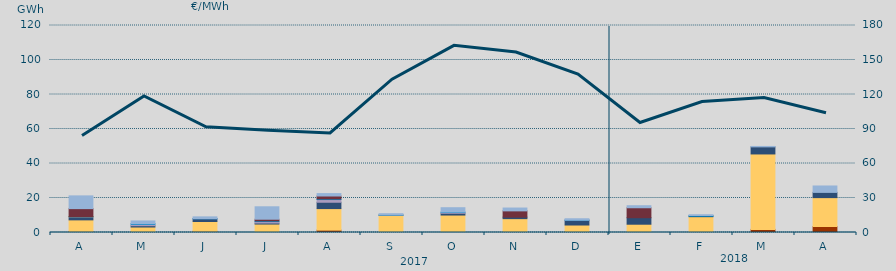
| Category | Carbón | Ciclo Combinado | Cogeneración | Consumo Bombeo | Enlace Península Baleares | Eólica | Hidráulica | Internacionales | Residuos no Renovables | Solar fotovoltaica | Turbinación bombeo |
|---|---|---|---|---|---|---|---|---|---|---|---|
| A | 610 | 6714.7 | 0 | 1740 | 132.6 | 93.7 | 0 | 4549.7 | 0 | 0 | 7385.9 |
| M | 70 | 3116.9 | 0 | 762.7 | 846.6 | 0 | 410 | 0 | 0 | 0 | 1489.3 |
| J | 673.2 | 5702.5 | 0 | 1567.6 | 28.4 | 0 | 149.4 | 0 | 0 | 0 | 940.1 |
| J | 0 | 4906.7 | 0 | 593.2 | 844.1 | 0 | 376.7 | 973.2 | 0 | 0 | 7214.8 |
| A | 1372.5 | 12488.5 | 0 | 3675.7 | 1561.2 | 0 | 359.5 | 1700.4 | 0 | 0 | 1397.9 |
| S | 0 | 9962.3 | 0 | 123.8 | 0 | 0 | 40 | 0 | 0 | 0 | 759.3 |
| O | 0 | 10119.2 | 0 | 1038.2 | 495.2 | 0 | 208.4 | 0 | 0 | 0 | 2510.5 |
| N | 0 | 8034.3 | 0 | 863.8 | 0 | 0 | 0 | 3635.7 | 0 | 0 | 1650.6 |
| D | 374 | 3967.2 | 0 | 2746.1 | 58.6 | 0 | 52.1 | 0 | 0 | 0 | 774.9 |
| E | 0 | 4799.8 | 0 | 3776.1 | 0 | 0 | 0 | 5766.5 | 0 | 0 | 1181.9 |
| F | 0 | 9167.2 | 0 | 319.8 | 0 | 0 | 367.5 | 0 | 0 | 0 | 436 |
| M | 1806.7 | 43724.8 | 0 | 4108.1 | 0 | 0 | 0 | 0 | 0 | 0 | 249 |
| A | 3485.4 | 16735.1 | 0 | 3030.8 | 0 | 0 | 0 | 0 | 0 | 0 | 3717.6 |